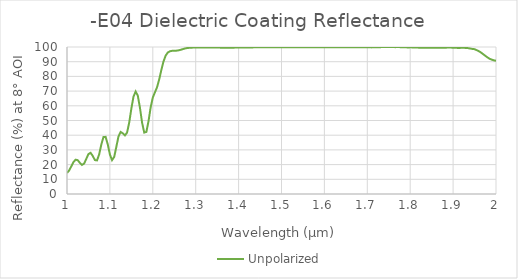
| Category | Unpolarized |
|---|---|
| 1.0 | 14.281 |
| 1.005 | 16.019 |
| 1.01 | 18.793 |
| 1.015 | 21.679 |
| 1.02 | 23.359 |
| 1.025 | 23.007 |
| 1.03 | 21.174 |
| 1.035 | 19.802 |
| 1.04 | 20.744 |
| 1.045 | 23.924 |
| 1.05 | 27.178 |
| 1.055 | 28.004 |
| 1.06 | 25.909 |
| 1.065 | 23.074 |
| 1.07 | 22.85 |
| 1.075 | 26.991 |
| 1.08 | 33.657 |
| 1.085 | 38.726 |
| 1.09 | 38.859 |
| 1.095 | 33.775 |
| 1.1 | 26.89 |
| 1.105 | 23.032 |
| 1.11 | 25.18 |
| 1.115 | 32.104 |
| 1.12 | 39.131 |
| 1.125 | 42.221 |
| 1.13 | 41.289 |
| 1.135 | 39.816 |
| 1.14 | 41.796 |
| 1.145 | 48.565 |
| 1.15 | 58.06 |
| 1.155 | 66.248 |
| 1.16 | 69.708 |
| 1.165 | 66.953 |
| 1.17 | 58.77 |
| 1.175 | 48.59 |
| 1.18 | 41.795 |
| 1.185 | 42.223 |
| 1.19 | 49.455 |
| 1.195 | 58.927 |
| 1.2 | 65.636 |
| 1.205 | 69.183 |
| 1.21 | 72.701 |
| 1.215 | 78.062 |
| 1.22 | 84.44 |
| 1.225 | 90.192 |
| 1.23 | 94.176 |
| 1.235 | 96.25 |
| 1.24 | 97.102 |
| 1.245 | 97.382 |
| 1.25 | 97.452 |
| 1.255 | 97.516 |
| 1.26 | 97.714 |
| 1.265 | 98.092 |
| 1.27 | 98.556 |
| 1.275 | 98.986 |
| 1.28 | 99.296 |
| 1.285 | 99.446 |
| 1.29 | 99.542 |
| 1.295 | 99.605 |
| 1.3 | 99.614 |
| 1.305 | 99.608 |
| 1.31 | 99.599 |
| 1.315 | 99.595 |
| 1.32 | 99.615 |
| 1.325 | 99.642 |
| 1.33 | 99.669 |
| 1.335 | 99.694 |
| 1.34 | 99.714 |
| 1.345 | 99.695 |
| 1.35 | 99.657 |
| 1.355 | 99.598 |
| 1.36 | 99.531 |
| 1.365 | 99.511 |
| 1.37 | 99.531 |
| 1.375 | 99.554 |
| 1.38 | 99.567 |
| 1.385 | 99.564 |
| 1.39 | 99.572 |
| 1.395 | 99.597 |
| 1.4 | 99.628 |
| 1.405 | 99.639 |
| 1.41 | 99.637 |
| 1.415 | 99.662 |
| 1.42 | 99.705 |
| 1.425 | 99.729 |
| 1.43 | 99.728 |
| 1.435 | 99.745 |
| 1.44 | 99.768 |
| 1.445 | 99.785 |
| 1.45 | 99.779 |
| 1.455 | 99.784 |
| 1.46 | 99.805 |
| 1.465 | 99.804 |
| 1.47 | 99.799 |
| 1.475 | 99.817 |
| 1.48 | 99.816 |
| 1.485 | 99.831 |
| 1.49 | 99.848 |
| 1.495 | 99.853 |
| 1.5 | 99.839 |
| 1.505 | 99.839 |
| 1.51 | 99.841 |
| 1.515 | 99.854 |
| 1.52 | 99.853 |
| 1.525 | 99.844 |
| 1.53 | 99.847 |
| 1.535 | 99.838 |
| 1.54 | 99.841 |
| 1.545 | 99.835 |
| 1.55 | 99.848 |
| 1.555 | 99.832 |
| 1.56 | 99.829 |
| 1.565 | 99.838 |
| 1.57 | 99.832 |
| 1.575 | 99.834 |
| 1.58 | 99.818 |
| 1.585 | 99.814 |
| 1.59 | 99.833 |
| 1.595 | 99.824 |
| 1.6 | 99.822 |
| 1.605 | 99.829 |
| 1.61 | 99.835 |
| 1.615 | 99.843 |
| 1.62 | 99.832 |
| 1.625 | 99.846 |
| 1.63 | 99.826 |
| 1.635 | 99.811 |
| 1.64 | 99.837 |
| 1.645 | 99.859 |
| 1.65 | 99.86 |
| 1.655 | 99.844 |
| 1.66 | 99.771 |
| 1.665 | 99.813 |
| 1.67 | 99.813 |
| 1.675 | 99.795 |
| 1.68 | 99.804 |
| 1.685 | 99.778 |
| 1.69 | 99.806 |
| 1.695 | 99.814 |
| 1.7 | 99.814 |
| 1.705 | 99.807 |
| 1.71 | 99.739 |
| 1.715 | 99.763 |
| 1.72 | 99.866 |
| 1.725 | 99.913 |
| 1.73 | 99.909 |
| 1.735 | 99.922 |
| 1.74 | 99.947 |
| 1.745 | 99.933 |
| 1.75 | 99.959 |
| 1.755 | 99.997 |
| 1.76 | 99.973 |
| 1.765 | 99.9 |
| 1.77 | 99.952 |
| 1.775 | 99.93 |
| 1.78 | 99.834 |
| 1.785 | 99.806 |
| 1.79 | 99.774 |
| 1.795 | 99.689 |
| 1.8 | 99.762 |
| 1.805 | 99.731 |
| 1.81 | 99.685 |
| 1.815 | 99.638 |
| 1.82 | 99.556 |
| 1.825 | 99.564 |
| 1.83 | 99.522 |
| 1.835 | 99.454 |
| 1.84 | 99.476 |
| 1.845 | 99.475 |
| 1.85 | 99.47 |
| 1.855 | 99.441 |
| 1.86 | 99.566 |
| 1.865 | 99.565 |
| 1.87 | 99.492 |
| 1.875 | 99.506 |
| 1.88 | 99.554 |
| 1.885 | 99.569 |
| 1.89 | 99.632 |
| 1.895 | 99.59 |
| 1.9 | 99.519 |
| 1.905 | 99.569 |
| 1.91 | 99.368 |
| 1.915 | 99.339 |
| 1.92 | 99.486 |
| 1.925 | 99.453 |
| 1.93 | 99.333 |
| 1.935 | 99.227 |
| 1.94 | 98.947 |
| 1.945 | 98.696 |
| 1.95 | 98.523 |
| 1.955 | 97.851 |
| 1.96 | 97.143 |
| 1.965 | 96.259 |
| 1.97 | 95.119 |
| 1.975 | 94.041 |
| 1.98 | 92.945 |
| 1.985 | 92.013 |
| 1.99 | 91.418 |
| 1.995 | 90.931 |
| 2.0 | 90.66 |